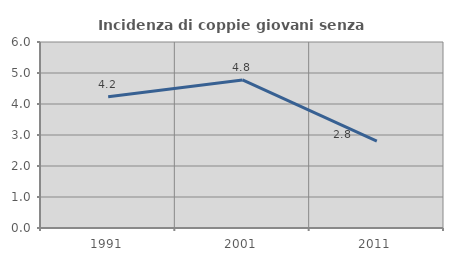
| Category | Incidenza di coppie giovani senza figli |
|---|---|
| 1991.0 | 4.237 |
| 2001.0 | 4.776 |
| 2011.0 | 2.804 |